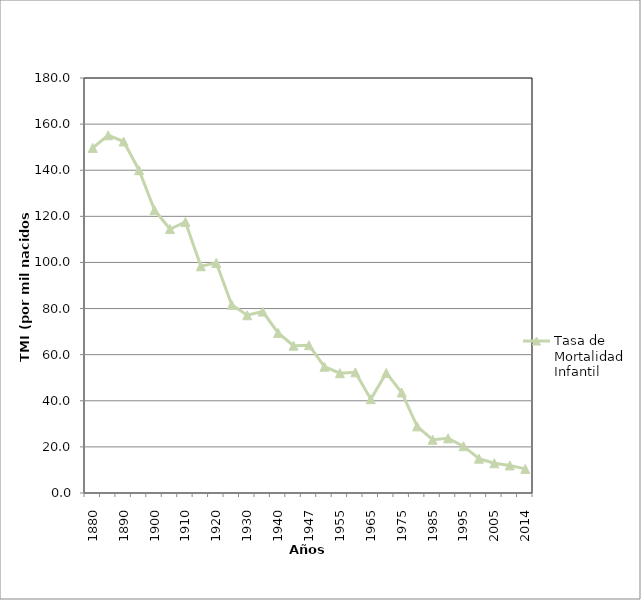
| Category | Tasa de Mortalidad Infantil |
|---|---|
| 1880.0 | 149.687 |
| 1885.0 | 155.15 |
| 1890.0 | 152.453 |
| 1895.0 | 140.017 |
| 1900.0 | 122.756 |
| 1905.0 | 114.476 |
| 1910.0 | 117.571 |
| 1915.0 | 98.342 |
| 1920.0 | 99.808 |
| 1925.0 | 81.627 |
| 1930.0 | 77.091 |
| 1935.0 | 78.7 |
| 1940.0 | 69.436 |
| 1945.0 | 63.917 |
| 1947.0 | 64.094 |
| 1950.0 | 54.764 |
| 1955.0 | 51.938 |
| 1960.0 | 52.331 |
| 1965.0 | 40.696 |
| 1970.0 | 52.1 |
| 1975.0 | 43.6 |
| 1980.0 | 28.9 |
| 1985.0 | 23.1 |
| 1990.0 | 23.7 |
| 1995.0 | 20.3 |
| 2000.0 | 14.9 |
| 2005.0 | 12.9 |
| 2010.0 | 11.958 |
| 2014.0 | 10.452 |